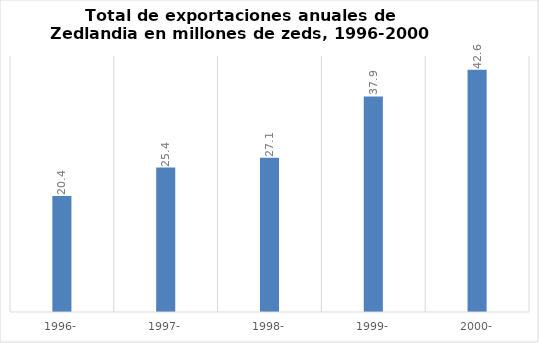
| Category | Total de exportaciones anuales de Zedlandia en millones de zeds, 1996-2000 |
|---|---|
| 1996- | 20.4 |
| 1997- | 25.4 |
| 1998- | 27.1 |
| 1999- | 37.9 |
| 2000- | 42.6 |